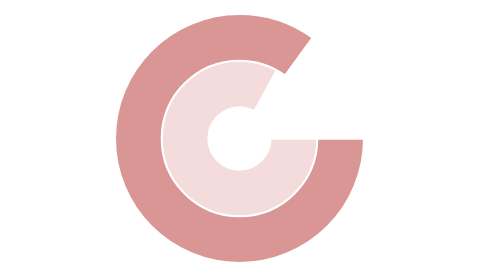
| Category | Series 1 | Series 0 |
|---|---|---|
| 0 | 0.83 | 0.85 |
| 1 | 0.17 | 0.15 |